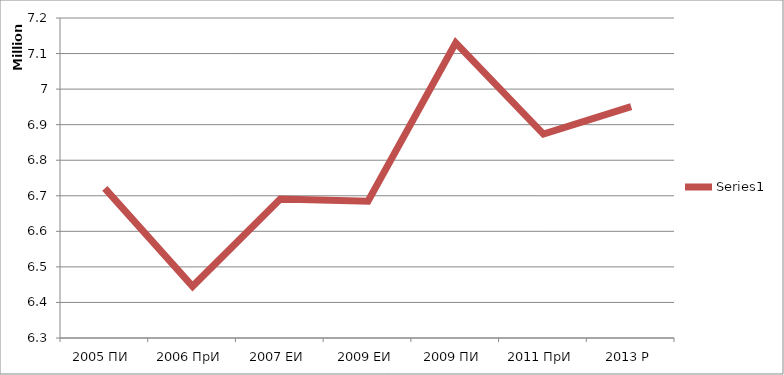
| Category | Series 0 |
|---|---|
| 2005 ПИ | 6720941 |
| 2006 ПрИ | 6445260 |
| 2007 ЕИ | 6691080 |
| 2009 ЕИ | 6684770 |
| 2009 ПИ | 7129965 |
| 2011 ПрИ | 6873589 |
| 2013 Р | 6950900 |